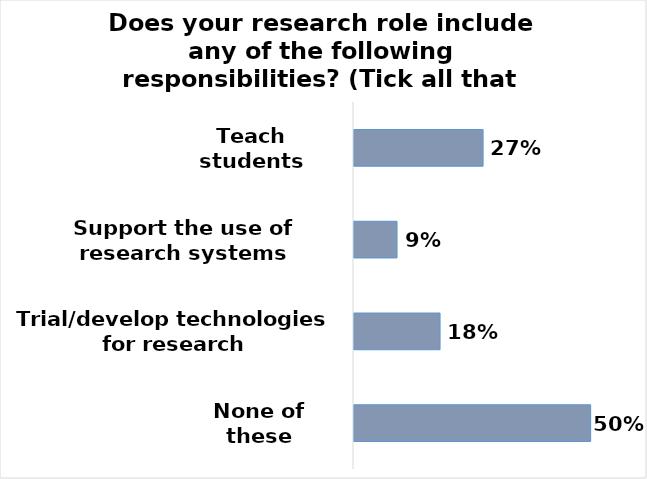
| Category | Series 0 |
|---|---|
| Teach students | 0.273 |
| Support the use of research systems | 0.091 |
| Trial/develop technologies for research | 0.182 |
| None of these | 0.5 |